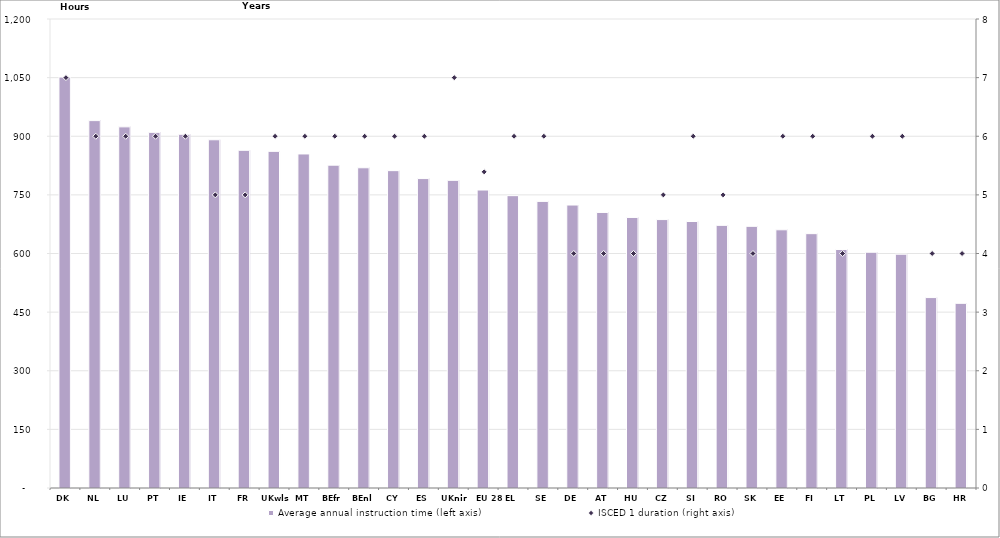
| Category | Average annual instruction time (left axis) |
|---|---|
| DK | 1051.429 |
| NL | 940 |
| LU | 924 |
| PT | 910 |
| IE | 905 |
| IT | 891 |
| FR | 864 |
| UKwls | 861.333 |
| MT | 854.667 |
| BEfr | 826 |
| BEnl | 819.333 |
| CY | 812 |
| ES | 791.723 |
| UKnir | 787.143 |
| EU 28 | 762.41 |
| EL | 748 |
| SE | 733.333 |
| DE | 724 |
| AT | 705 |
| HU | 692.25 |
| CZ | 686.8 |
| SI | 681.875 |
| RO | 672 |
| SK | 669.5 |
| EE | 660.625 |
| FI | 650.75 |
| LT | 610.25 |
| PL | 603.167 |
| LV | 598.167 |
| BG | 487.25 |
| HR | 472.5 |